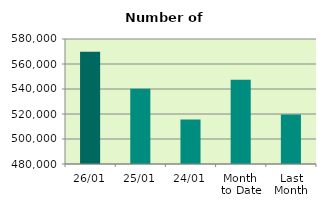
| Category | Series 0 |
|---|---|
| 26/01 | 569804 |
| 25/01 | 540116 |
| 24/01 | 515654 |
| Month 
to Date | 547481.684 |
| Last
Month | 519611.714 |